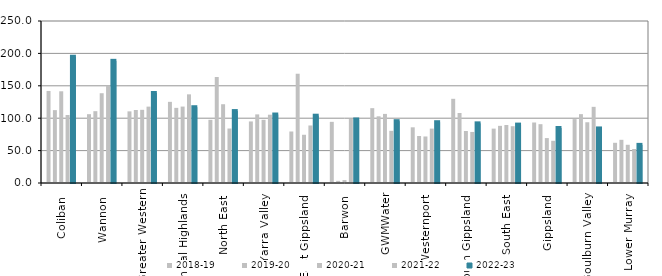
| Category | 2018-19 | 2019-20 | 2020-21 | 2021-22 | 2022-23 |
|---|---|---|---|---|---|
| Coliban  | 142.052 | 112.454 | 141.53 | 104.985 | 194.964 |
| Wannon  | 106.216 | 110.845 | 138.541 | 150.207 | 188.523 |
| Greater Western | 110.548 | 112.67 | 112.905 | 117.862 | 138.865 |
| Central Highlands  | 125.241 | 115.954 | 117.938 | 136.823 | 116.949 |
| North East  | 97.508 | 163.599 | 121.565 | 84.058 | 111.005 |
| Yarra Valley  | 94.999 | 105.885 | 97.54 | 105.387 | 105.685 |
| East Gippsland  | 79.472 | 168.629 | 74.43 | 88.763 | 103.845 |
| Barwon  | 94.37 | 3.337 | 4.514 | 98.788 | 98.034 |
| GWMWater | 115.491 | 102.923 | 106.631 | 80.541 | 95.394 |
| Westernport  | 85.934 | 72.526 | 71.799 | 83.94 | 93.808 |
| South Gippsland  | 129.92 | 108.063 | 80.234 | 78.783 | 92.04 |
| South East  | 83.916 | 88.209 | 89.465 | 87.653 | 90.124 |
| Gippsland  | 93.37 | 90.767 | 69.324 | 65.137 | 84.853 |
| Goulburn Valley  | 98.602 | 106.264 | 93.727 | 117.524 | 84.192 |
| Lower Murray  | 62.038 | 66.647 | 58.983 | 52.43 | 58.825 |